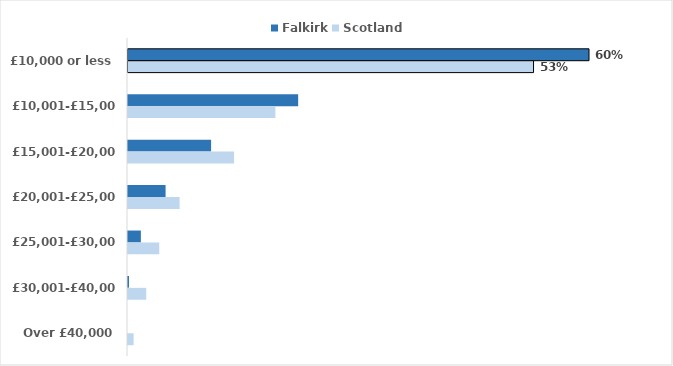
| Category | Falkirk | Scotland |
|---|---|---|
| £10,000 or less | 0.602 | 0.53 |
| £10,001-£15,000 | 0.222 | 0.192 |
| £15,001-£20,000 | 0.109 | 0.139 |
| £20,001-£25,000 | 0.049 | 0.067 |
| £25,001-£30,000 | 0.017 | 0.041 |
| £30,001-£40,000 | 0.001 | 0.024 |
| Over £40,000 | 0 | 0.007 |